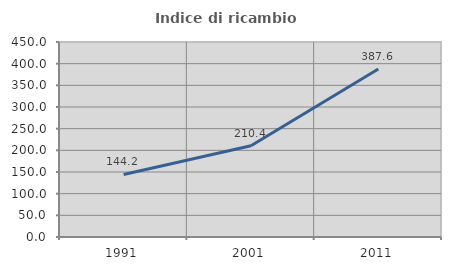
| Category | Indice di ricambio occupazionale  |
|---|---|
| 1991.0 | 144.237 |
| 2001.0 | 210.447 |
| 2011.0 | 387.578 |